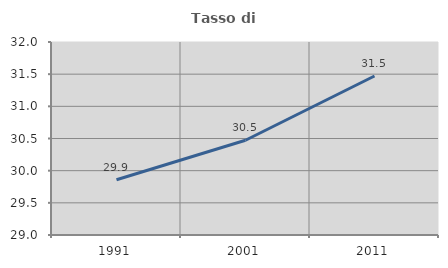
| Category | Tasso di occupazione   |
|---|---|
| 1991.0 | 29.859 |
| 2001.0 | 30.472 |
| 2011.0 | 31.472 |